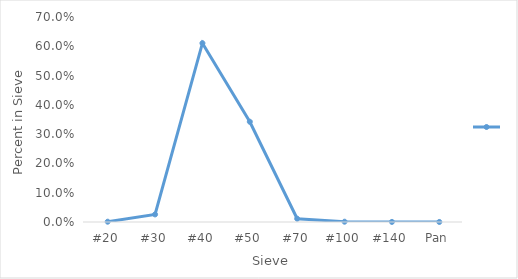
| Category | Series 0 |
|---|---|
| #20 | 0.001 |
| #30 | 0.026 |
| #40 | 0.611 |
| #50 | 0.342 |
| #70 | 0.011 |
| #100 | 0.001 |
| #140 | 0 |
| Pan | 0 |